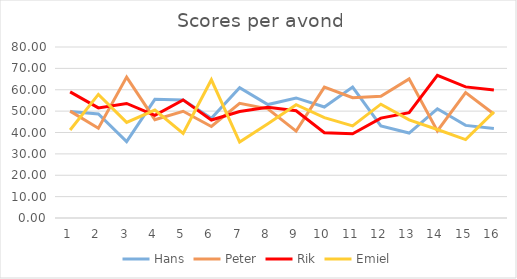
| Category | Hans | Peter | Rik | Emiel |
|---|---|---|---|---|
| 0 | 49.83 | 50 | 59 | 41.17 |
| 1 | 48.67 | 42 | 51.5 | 57.83 |
| 2 | 35.75 | 65.92 | 53.58 | 44.75 |
| 3 | 55.5 | 46 | 48 | 50.5 |
| 4 | 55.25 | 49.92 | 55.25 | 39.58 |
| 5 | 46.67 | 42.83 | 45.83 | 64.67 |
| 6 | 61 | 53.67 | 49.83 | 35.5 |
| 7 | 53.08 | 51.08 | 51.75 | 44.08 |
| 8 | 56.17 | 40.67 | 50.17 | 53 |
| 9 | 51.92 | 61.25 | 39.92 | 46.92 |
| 10 | 61.25 | 56.25 | 39.42 | 43.08 |
| 11 | 43.08 | 56.92 | 46.75 | 53.25 |
| 12 | 39.75 | 65.08 | 49.25 | 45.92 |
| 13 | 51.08 | 40.75 | 66.75 | 41.42 |
| 14 | 43.33 | 58.67 | 61.33 | 36.67 |
| 15 | 41.83 | 48.67 | 59.83 | 49.67 |